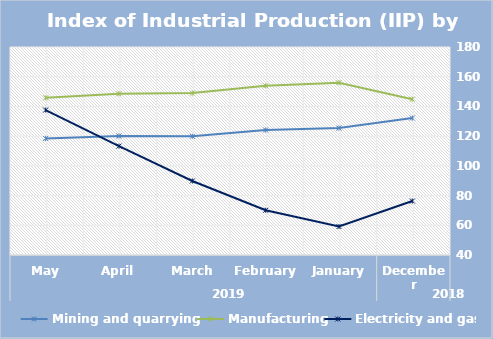
| Category | Mining and quarrying   | Manufacturing | Electricity and gas |
|---|---|---|---|
| 0 | 132.18 | 144.85 | 76.31 |
| 1 | 125.45 | 155.98 | 59.15 |
| 2 | 124.14 | 153.87 | 70.1 |
| 3 | 119.87 | 148.98 | 89.82 |
| 4 | 120.11 | 148.54 | 113.29 |
| 5 | 118.43 | 145.76 | 137.57 |